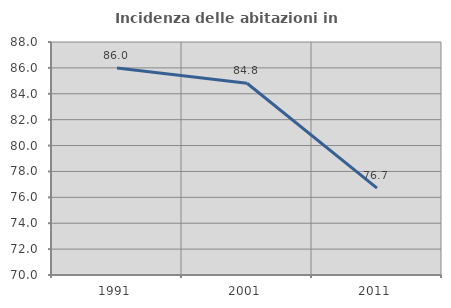
| Category | Incidenza delle abitazioni in proprietà  |
|---|---|
| 1991.0 | 86 |
| 2001.0 | 84.816 |
| 2011.0 | 76.712 |